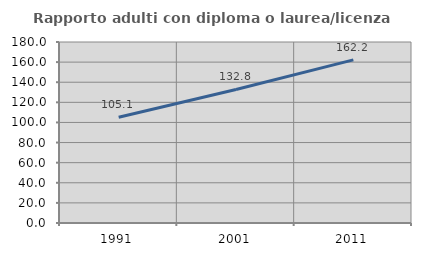
| Category | Rapporto adulti con diploma o laurea/licenza media  |
|---|---|
| 1991.0 | 105.082 |
| 2001.0 | 132.785 |
| 2011.0 | 162.179 |